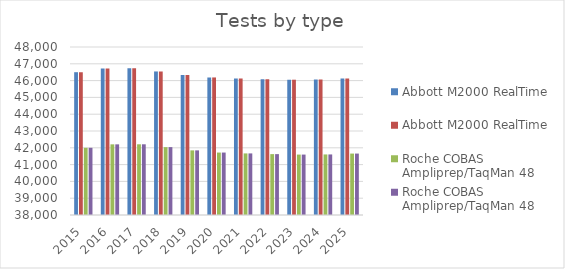
| Category | Abbott M2000 RealTime | Roche COBAS Ampliprep/TaqMan 48 |
|---|---|---|
| 2015.0 | 46500 | 42000 |
| 2016.0 | 46727.67 | 42205.637 |
| 2017.0 | 46730.912 | 42208.566 |
| 2018.0 | 46544.515 | 42040.207 |
| 2019.0 | 46330.741 | 41847.121 |
| 2020.0 | 46187.274 | 41717.538 |
| 2021.0 | 46130.399 | 41666.167 |
| 2022.0 | 46083.203 | 41623.538 |
| 2023.0 | 46053.388 | 41596.609 |
| 2024.0 | 46062.359 | 41604.712 |
| 2025.0 | 46119.697 | 41656.501 |